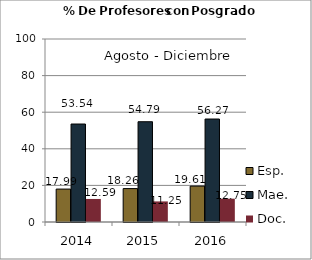
| Category | Esp. | Mae. | Doc. |
|---|---|---|---|
| 2014.0 | 17.99 | 53.54 | 12.59 |
| 2015.0 | 18.26 | 54.79 | 11.25 |
| 2016.0 | 19.61 | 56.27 | 12.75 |